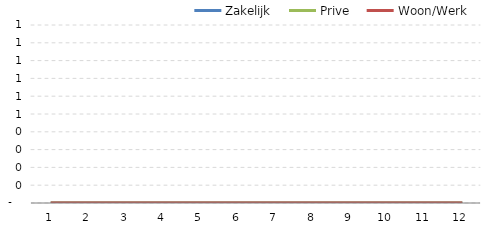
| Category | Zakelijk | Prive | Woon/Werk |
|---|---|---|---|
| 0 | 0 | 0 | 0 |
| 1 | 0 | 0 | 0 |
| 2 | 0 | 0 | 0 |
| 3 | 0 | 0 | 0 |
| 4 | 0 | 0 | 0 |
| 5 | 0 | 0 | 0 |
| 6 | 0 | 0 | 0 |
| 7 | 0 | 0 | 0 |
| 8 | 0 | 0 | 0 |
| 9 | 0 | 0 | 0 |
| 10 | 0 | 0 | 0 |
| 11 | 0 | 0 | 0 |